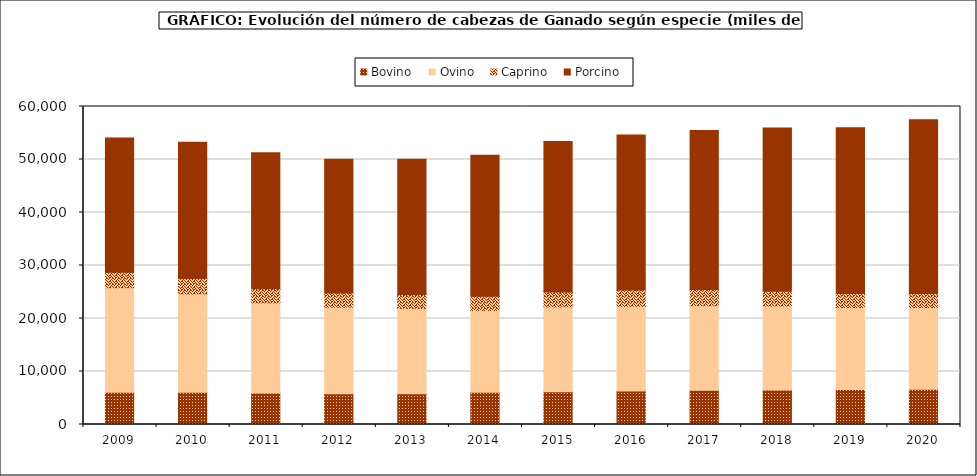
| Category | Bovino | Ovino | Caprino | Porcino |
|---|---|---|---|---|
| 2009.0 | 6082.442 | 19718.195 | 2933.782 | 25342.606 |
| 2010.0 | 6075 | 18552 | 2904 | 25704 |
| 2011.0 | 5923 | 17003 | 2693 | 25635 |
| 2012.0 | 5812.605 | 16339.373 | 2637.336 | 25250.377 |
| 2013.0 | 5802.22 | 16118.586 | 2609.989 | 25494.715 |
| 2014.0 | 6078.733 | 15431.804 | 2704.228 | 26567.578 |
| 2015.0 | 6182.908 | 16026.374 | 2801.064 | 28367.335 |
| 2016.0 | 6317.641 | 15962.892 | 3088.035 | 29231.595 |
| 2017.0 | 6465.747 | 15963.106 | 3059.731 | 29971.357 |
| 2018.0 | 6510.592 | 15852.525 | 2764.79 | 30804.102 |
| 2019.0 | 6600 | 15478 | 2659 | 31246 |
| 2020.0 | 6636 | 15440 | 2652 | 32795 |